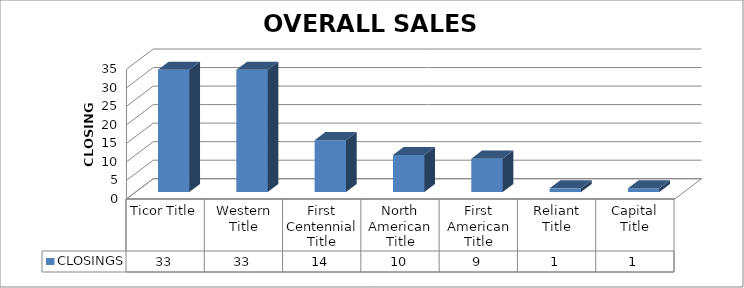
| Category | CLOSINGS |
|---|---|
| Ticor Title | 33 |
| Western Title | 33 |
| First Centennial Title | 14 |
| North American Title | 10 |
| First American Title | 9 |
| Reliant Title | 1 |
| Capital Title | 1 |